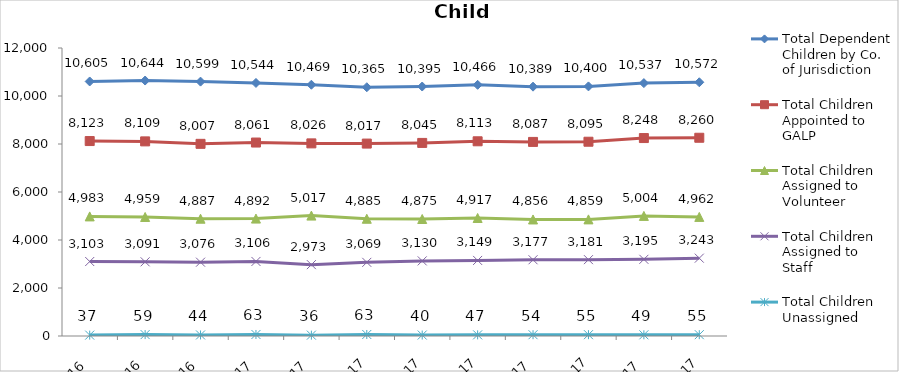
| Category | Total Dependent Children by Co. of Jurisdiction | Total Children Appointed to GALP | Total Children Assigned to Volunteer | Total Children Assigned to Staff | Total Children Unassigned |
|---|---|---|---|---|---|
| 2016-10-01 | 10605 | 8123 | 4983 | 3103 | 37 |
| 2016-11-01 | 10644 | 8109 | 4959 | 3091 | 59 |
| 2016-12-01 | 10599 | 8007 | 4887 | 3076 | 44 |
| 2017-01-01 | 10544 | 8061 | 4892 | 3106 | 63 |
| 2017-02-01 | 10469 | 8026 | 5017 | 2973 | 36 |
| 2017-03-01 | 10365 | 8017 | 4885 | 3069 | 63 |
| 2017-04-01 | 10395 | 8045 | 4875 | 3130 | 40 |
| 2017-05-01 | 10466 | 8113 | 4917 | 3149 | 47 |
| 2017-06-01 | 10389 | 8087 | 4856 | 3177 | 54 |
| 2017-07-01 | 10400 | 8095 | 4859 | 3181 | 55 |
| 2017-08-01 | 10537 | 8248 | 5004 | 3195 | 49 |
| 2017-09-01 | 10572 | 8260 | 4962 | 3243 | 55 |